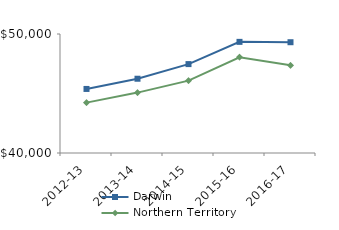
| Category | Darwin | Northern Territory |
|---|---|---|
| 2012-13 | 45382.84 | 44232.02 |
| 2013-14 | 46241 | 45075.51 |
| 2014-15 | 47470.9 | 46083.65 |
| 2015-16 | 49339 | 48046.27 |
| 2016-17 | 49309.4 | 47367.05 |